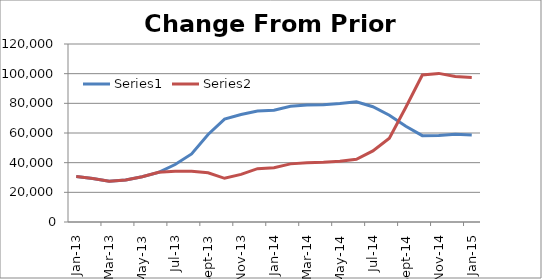
| Category | Series 0 | Series 1 |
|---|---|---|
| 2013-01-01 | 30603 | 30603 |
| 2013-02-01 | 29312 | 29312 |
| 2013-03-01 | 27551 | 27551 |
| 2013-04-01 | 28314 | 28314 |
| 2013-05-01 | 30471 | 30471 |
| 2013-06-01 | 33483 | 33483 |
| 2013-07-01 | 38739 | 34225 |
| 2013-08-01 | 45884 | 34204 |
| 2013-09-01 | 59033 | 33186 |
| 2013-10-01 | 69326 | 29456 |
| 2013-11-01 | 72476 | 32131 |
| 2013-12-01 | 74782 | 35941.333 |
| 2014-01-01 | 75410 | 36569.333 |
| 2014-02-01 | 78028 | 39187.333 |
| 2014-03-01 | 78854 | 40013.333 |
| 2014-04-01 | 79087 | 40246.333 |
| 2014-05-01 | 79826 | 40985.333 |
| 2014-06-01 | 81068 | 42227.333 |
| 2014-07-01 | 77732 | 47919.333 |
| 2014-08-01 | 72015 | 56534.333 |
| 2014-09-01 | 64500 | 77353.333 |
| 2014-10-01 | 58230 | 99129.333 |
| 2014-11-01 | 58334 | 100183.333 |
| 2014-12-01 | 59190 | 98030.667 |
| 2015-01-01 | 58582 | 97422.667 |